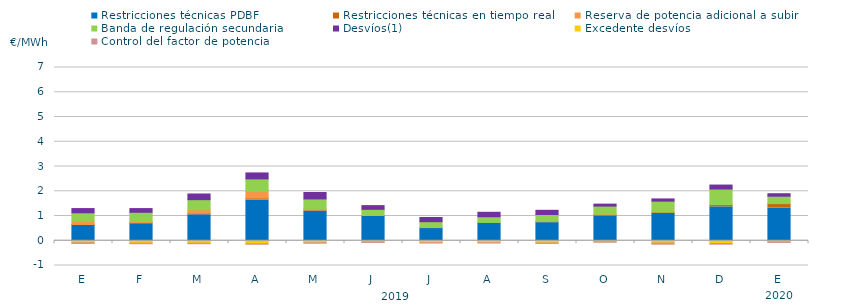
| Category | Restricciones técnicas PDBF | Restricciones técnicas en tiempo real | Reserva de potencia adicional a subir | Banda de regulación secundaria | Desvíos(1) | Excedente desvíos | Control del factor de potencia |
|---|---|---|---|---|---|---|---|
| E | 0.63 | 0.03 | 0.12 | 0.35 | 0.17 | -0.08 | -0.07 |
| F | 0.71 | 0.01 | 0.06 | 0.37 | 0.15 | -0.1 | -0.06 |
| M | 1.05 | 0.06 | 0.14 | 0.41 | 0.23 | -0.1 | -0.06 |
| A | 1.64 | 0.08 | 0.27 | 0.51 | 0.24 | -0.12 | -0.06 |
| M | 1.21 | 0.03 | 0.06 | 0.39 | 0.26 | -0.08 | -0.06 |
| J | 1.01 | 0.01 | 0 | 0.25 | 0.15 | -0.05 | -0.06 |
| J | 0.51 | 0.02 | 0.01 | 0.23 | 0.17 | -0.08 | -0.05 |
| A | 0.73 | 0.01 | 0 | 0.23 | 0.18 | -0.08 | -0.05 |
| S | 0.73 | 0.05 | 0 | 0.28 | 0.17 | -0.09 | -0.06 |
| O | 0.98 | 0.07 | 0.03 | 0.32 | 0.08 | -0.04 | -0.06 |
| N | 1.11 | 0.05 | 0 | 0.44 | 0.09 | -0.09 | -0.09 |
| D | 1.37 | 0.09 | 0 | 0.63 | 0.16 | -0.11 | -0.07 |
| E | 1.32 | 0.18 | 0 | 0.3 | 0.1 | -0.05 | -0.06 |